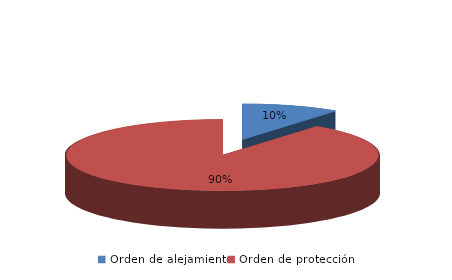
| Category | Series 0 |
|---|---|
| Orden de alejamiento | 27 |
| Orden de protección | 241 |